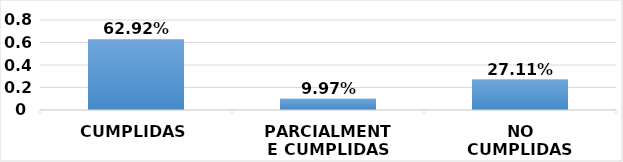
| Category | Series 0 |
|---|---|
| CUMPLIDAS | 0.629 |
| PARCIALMENTE CUMPLIDAS | 0.1 |
| NO CUMPLIDAS | 0.271 |